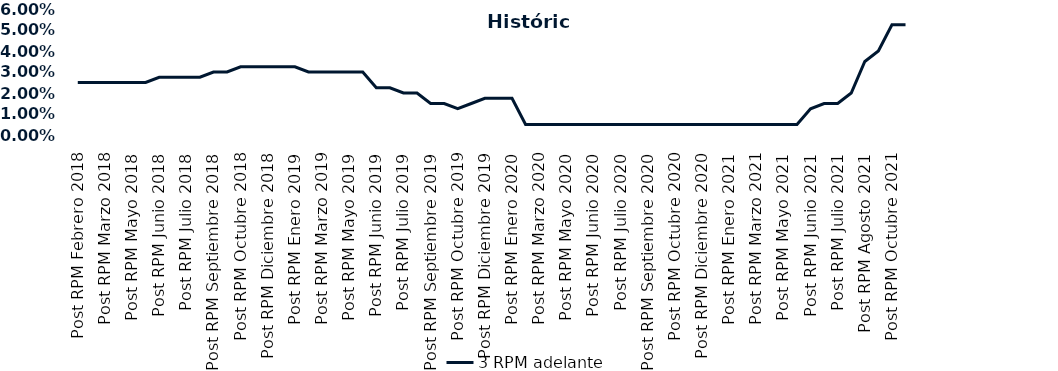
| Category | 3 RPM adelante |
|---|---|
| Post RPM Febrero 2018 | 0.025 |
| Pre RPM Marzo 2018 | 0.025 |
| Post RPM Marzo 2018 | 0.025 |
| Pre RPM Mayo 2018 | 0.025 |
| Post RPM Mayo 2018 | 0.025 |
| Pre RPM Junio 2018 | 0.025 |
| Post RPM Junio 2018 | 0.028 |
| Pre RPM Julio 2018 | 0.028 |
| Post RPM Julio 2018 | 0.028 |
| Pre RPM Septiembre 2018 | 0.028 |
| Post RPM Septiembre 2018 | 0.03 |
| Pre RPM Octubre 2018 | 0.03 |
| Post RPM Octubre 2018 | 0.032 |
| Pre RPM Diciembre 2018 | 0.032 |
| Post RPM Diciembre 2018 | 0.032 |
| Pre RPM Enero 2019 | 0.032 |
| Post RPM Enero 2019 | 0.032 |
| Pre RPM Marzo 2019 | 0.03 |
| Post RPM Marzo 2019 | 0.03 |
| Pre RPM Mayo 2019 | 0.03 |
| Post RPM Mayo 2019 | 0.03 |
| Pre RPM Junio 2019 | 0.03 |
| Post RPM Junio 2019 | 0.022 |
| Pre RPM Julio 2019 | 0.022 |
| Post RPM Julio 2019 | 0.02 |
| Pre RPM Septiembre 2019 | 0.02 |
| Post RPM Septiembre 2019 | 0.015 |
| Pre RPM Octubre 2019 | 0.015 |
| Post RPM Octubre 2019 | 0.012 |
| Pre RPM Diciembre 2019 | 0.015 |
| Post RPM Diciembre 2019 | 0.018 |
| Pre RPM Enero 2020 | 0.018 |
| Post RPM Enero 2020 | 0.018 |
| Pre RPM Marzo 2020 | 0.005 |
| Post RPM Marzo 2020 | 0.005 |
| Pre RPM Mayo 2020 | 0.005 |
| Post RPM Mayo 2020 | 0.005 |
| Pre RPM Junio 2020 | 0.005 |
| Post RPM Junio 2020 | 0.005 |
| Pre RPM Julio 2020 | 0.005 |
| Post RPM Julio 2020 | 0.005 |
| Pre RPM Septiembre 2020 | 0.005 |
| Post RPM Septiembre 2020 | 0.005 |
| Pre RPM Octubre 2020 | 0.005 |
| Post RPM Octubre 2020 | 0.005 |
| Pre RPM Diciembre 2020 | 0.005 |
| Post RPM Diciembre 2020 | 0.005 |
| Pre RPM Enero 2021 | 0.005 |
| Post RPM Enero 2021 | 0.005 |
| Pre RPM Marzo 2021 | 0.005 |
| Post RPM Marzo 2021 | 0.005 |
| Pre RPM Mayo 2021 | 0.005 |
| Post RPM Mayo 2021 | 0.005 |
| Pre RPM Junio 2021 | 0.005 |
| Post RPM Junio 2021 | 0.012 |
| Pre RPM Julio 2021 | 0.015 |
| Post RPM Julio 2021 | 0.015 |
| Pre RPM Agosto 2021 | 0.02 |
| Post RPM Agosto 2021 | 0.035 |
| Pre RPM Octubre 2021 | 0.04 |
| Post RPM Octubre 2021 | 0.052 |
| Pre RPM Diciembre 2021 | 0.052 |